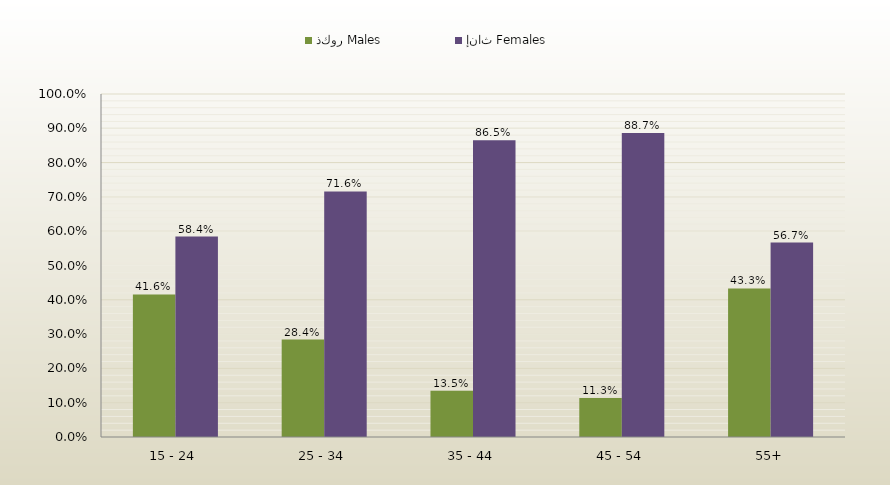
| Category | ذكور Males | إناث Females |
|---|---|---|
| 15 - 24 | 0.416 | 0.584 |
| 25 - 34 | 0.284 | 0.716 |
| 35 - 44 | 0.135 | 0.865 |
| 45 - 54 | 0.113 | 0.887 |
| 55+ | 0.433 | 0.567 |